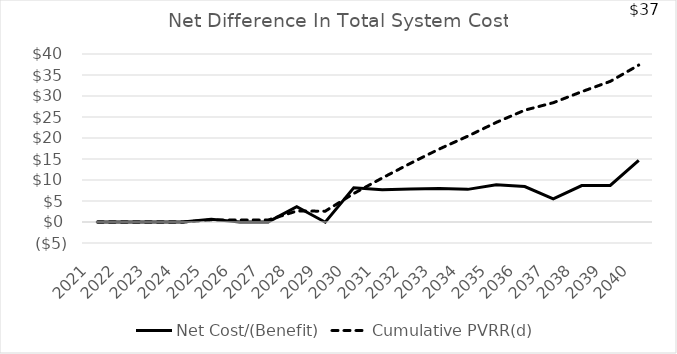
| Category | Net Cost/(Benefit) | Cumulative PVRR(d) |
|---|---|---|
| 2021.0 | 0 | 0 |
| 2022.0 | 0 | 0 |
| 2023.0 | 0 | 0 |
| 2024.0 | 0 | 0 |
| 2025.0 | 0.653 | 0.468 |
| 2026.0 | -0.003 | 0.467 |
| 2027.0 | 0.019 | 0.479 |
| 2028.0 | 3.624 | 2.607 |
| 2029.0 | -0.052 | 2.579 |
| 2030.0 | 8.172 | 6.78 |
| 2031.0 | 7.691 | 10.479 |
| 2032.0 | 7.851 | 14.013 |
| 2033.0 | 7.98 | 17.373 |
| 2034.0 | 7.77 | 20.434 |
| 2035.0 | 8.888 | 23.71 |
| 2036.0 | 8.448 | 26.623 |
| 2037.0 | 5.513 | 28.402 |
| 2038.0 | 8.686 | 31.025 |
| 2039.0 | 8.701 | 33.483 |
| 2040.0 | 14.665 | 37.358 |